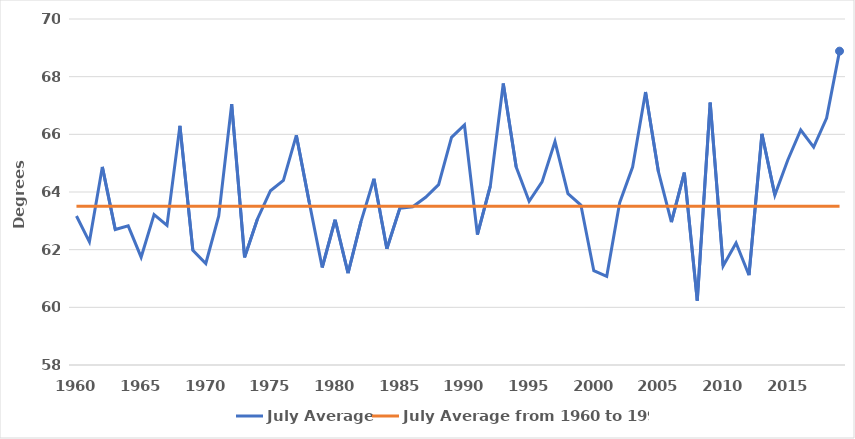
| Category | July Average | July Average from 1960 to 1990 |
|---|---|---|
| 1960.0 | 63.166 | 63.509 |
| 1961.0 | 62.27 | 63.509 |
| 1962.0 | 64.87 | 63.509 |
| 1963.0 | 62.698 | 63.509 |
| 1964.0 | 62.826 | 63.509 |
| 1965.0 | 61.739 | 63.509 |
| 1966.0 | 63.218 | 63.509 |
| 1967.0 | 62.843 | 63.509 |
| 1968.0 | 66.296 | 63.509 |
| 1969.0 | 61.975 | 63.509 |
| 1970.0 | 61.521 | 63.509 |
| 1971.0 | 63.168 | 63.509 |
| 1972.0 | 67.046 | 63.509 |
| 1973.0 | 61.732 | 63.509 |
| 1974.0 | 63.071 | 63.509 |
| 1975.0 | 64.043 | 63.509 |
| 1976.0 | 64.401 | 63.509 |
| 1977.0 | 65.967 | 63.509 |
| 1978.0 | 63.64 | 63.509 |
| 1979.0 | 61.382 | 63.509 |
| 1980.0 | 63.037 | 63.509 |
| 1981.0 | 61.188 | 63.509 |
| 1982.0 | 62.971 | 63.509 |
| 1983.0 | 64.46 | 63.509 |
| 1984.0 | 62.034 | 63.509 |
| 1985.0 | 63.432 | 63.509 |
| 1986.0 | 63.49 | 63.509 |
| 1987.0 | 63.816 | 63.509 |
| 1988.0 | 64.254 | 63.509 |
| 1989.0 | 65.893 | 63.509 |
| 1990.0 | 66.325 | 63.509 |
| 1991.0 | 62.524 | 63.509 |
| 1992.0 | 64.208 | 63.509 |
| 1993.0 | 67.765 | 63.509 |
| 1994.0 | 64.865 | 63.509 |
| 1995.0 | 63.681 | 63.509 |
| 1996.0 | 64.35 | 63.509 |
| 1997.0 | 65.748 | 63.509 |
| 1998.0 | 63.945 | 63.509 |
| 1999.0 | 63.547 | 63.509 |
| 2000.0 | 61.269 | 63.509 |
| 2001.0 | 61.076 | 63.509 |
| 2002.0 | 63.629 | 63.509 |
| 2003.0 | 64.867 | 63.509 |
| 2004.0 | 67.469 | 63.509 |
| 2005.0 | 64.697 | 63.509 |
| 2006.0 | 62.957 | 63.509 |
| 2007.0 | 64.674 | 63.509 |
| 2008.0 | 60.23 | 63.509 |
| 2009.0 | 67.097 | 63.509 |
| 2010.0 | 61.436 | 63.509 |
| 2011.0 | 62.232 | 63.509 |
| 2012.0 | 61.115 | 63.509 |
| 2013.0 | 66.016 | 63.509 |
| 2014.0 | 63.893 | 63.509 |
| 2015.0 | 65.112 | 63.509 |
| 2016.0 | 66.15 | 63.509 |
| 2017.0 | 65.558 | 63.509 |
| 2018.0 | 66.564 | 63.509 |
| 2019.0 | 68.885 | 63.509 |